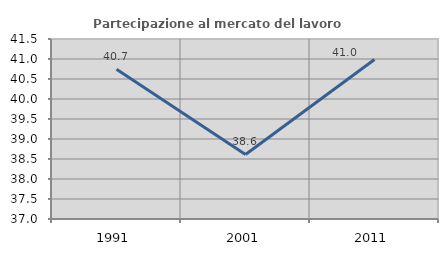
| Category | Partecipazione al mercato del lavoro  femminile |
|---|---|
| 1991.0 | 40.744 |
| 2001.0 | 38.614 |
| 2011.0 | 40.989 |